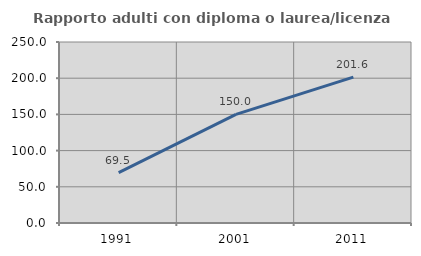
| Category | Rapporto adulti con diploma o laurea/licenza media  |
|---|---|
| 1991.0 | 69.492 |
| 2001.0 | 150 |
| 2011.0 | 201.562 |